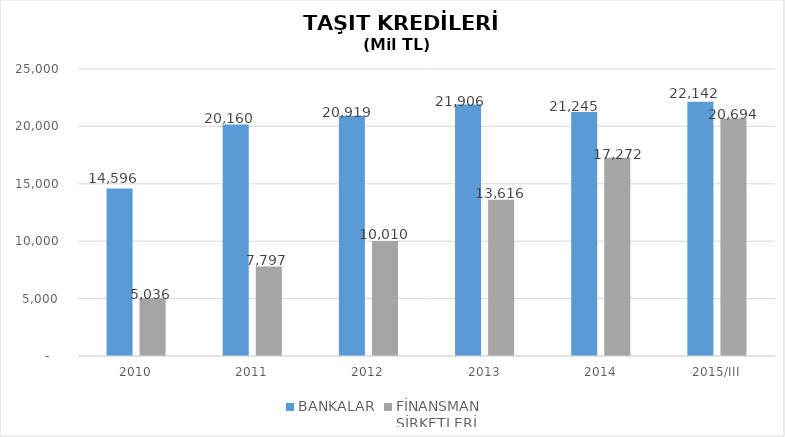
| Category | BANKALAR | FİNANSMAN 
ŞİRKETLERİ |
|---|---|---|
| 2010 | 14596 | 5035.89 |
| 2011 | 20160 | 7796.854 |
| 2012 | 20919 | 10009.755 |
| 2013 | 21906 | 13616.036 |
| 2014 | 21245 | 17271.844 |
| 2015/III | 22142 | 20693.621 |